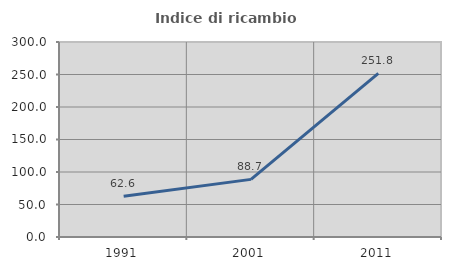
| Category | Indice di ricambio occupazionale  |
|---|---|
| 1991.0 | 62.609 |
| 2001.0 | 88.66 |
| 2011.0 | 251.786 |